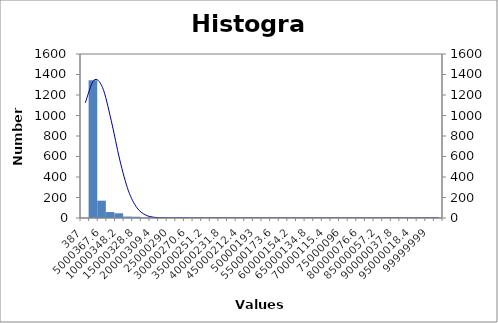
| Category | Series 0 |
|---|---|
| 387.0 | 1 |
| 2500377.3 | 1344 |
| 5000367.6 | 169 |
| 7500357.9 | 58 |
| 10000348.2 | 46 |
| 12500338.5 | 14 |
| 15000328.8 | 12 |
| 17500319.1 | 4 |
| 20000309.4 | 3 |
| 22500299.7 | 2 |
| 25000290.0 | 2 |
| 27500280.3 | 3 |
| 30000270.6 | 1 |
| 32500260.9 | 0 |
| 35000251.2 | 0 |
| 37500241.5 | 1 |
| 40000231.8 | 1 |
| 42500222.1 | 0 |
| 45000212.4 | 0 |
| 47500202.7 | 1 |
| 50000193.0 | 0 |
| 52500183.3 | 0 |
| 55000173.6 | 0 |
| 57500163.9 | 0 |
| 60000154.2 | 0 |
| 62500144.5 | 0 |
| 65000134.8 | 0 |
| 67500125.1 | 0 |
| 70000115.4 | 0 |
| 72500105.7 | 0 |
| 75000096.0 | 0 |
| 77500086.3 | 0 |
| 80000076.5999999 | 0 |
| 82500066.8999999 | 0 |
| 85000057.1999999 | 0 |
| 87500047.4999999 | 1 |
| 90000037.7999999 | 1 |
| 92500028.0999999 | 0 |
| 95000018.3999999 | 0 |
| 97500008.6999999 | 0 |
| 99999999.0 | 0 |
| 102499989.3 | 1 |